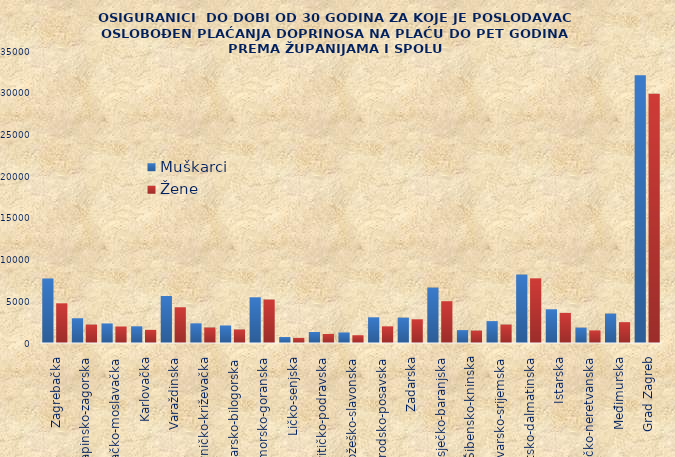
| Category | Muškarci | Žene |
|---|---|---|
| Zagrebačka | 7733 | 4760 |
| Krapinsko-zagorska | 2966 | 2207 |
| Sisačko-moslavačka | 2346 | 1979 |
| Karlovačka | 2001 | 1574 |
| Varaždinska | 5631 | 4285 |
| Koprivničko-križevačka | 2357 | 1853 |
| Bjelovarsko-bilogorska | 2102 | 1617 |
| Primorsko-goranska | 5477 | 5209 |
| Ličko-senjska | 715 | 613 |
| Virovitičko-podravska | 1318 | 1081 |
| Požeško-slavonska | 1261 | 931 |
| Brodsko-posavska | 3080 | 1996 |
| Zadarska | 3041 | 2843 |
| Osječko-baranjska | 6639 | 5010 |
| Šibensko-kninska | 1546 | 1490 |
| Vukovarsko-srijemska | 2623 | 2208 |
| Splitsko-dalmatinska | 8203 | 7752 |
| Istarska | 4041 | 3610 |
| Dubrovačko-neretvanska | 1843 | 1509 |
| Međimurska | 3527 | 2499 |
| Grad Zagreb | 32106 | 29866 |